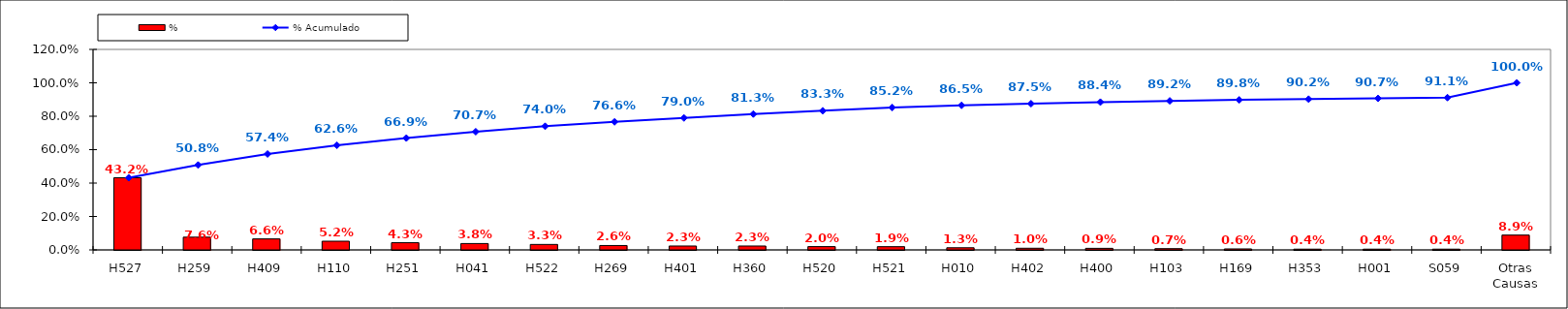
| Category | % |
|---|---|
| H527 | 0.432 |
| H259 | 0.076 |
| H409 | 0.066 |
| H110 | 0.052 |
| H251 | 0.043 |
| H041 | 0.038 |
| H522 | 0.033 |
| H269 | 0.026 |
| H401 | 0.023 |
| H360 | 0.023 |
| H520 | 0.02 |
| H521 | 0.019 |
| H010 | 0.013 |
| H402 | 0.01 |
| H400 | 0.009 |
| H103 | 0.007 |
| H169 | 0.006 |
| H353 | 0.004 |
| H001 | 0.004 |
| S059 | 0.004 |
| Otras Causas | 0.089 |